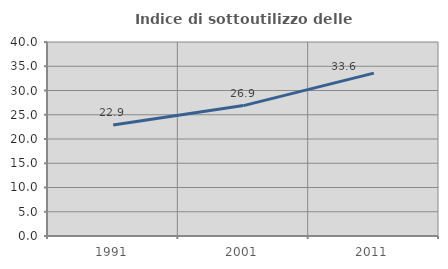
| Category | Indice di sottoutilizzo delle abitazioni  |
|---|---|
| 1991.0 | 22.892 |
| 2001.0 | 26.89 |
| 2011.0 | 33.582 |